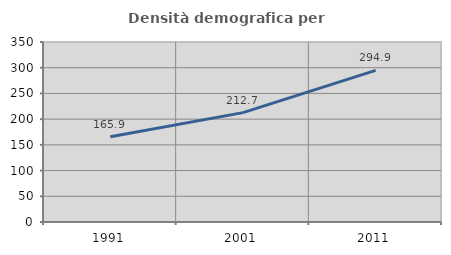
| Category | Densità demografica |
|---|---|
| 1991.0 | 165.914 |
| 2001.0 | 212.689 |
| 2011.0 | 294.913 |